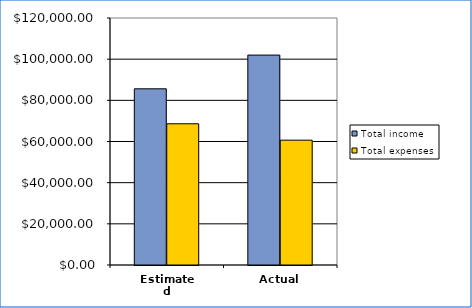
| Category | Total income | Total expenses |
|---|---|---|
| Estimated | 85602 | 68615.25 |
| Actual | 101984 | 60650.86 |